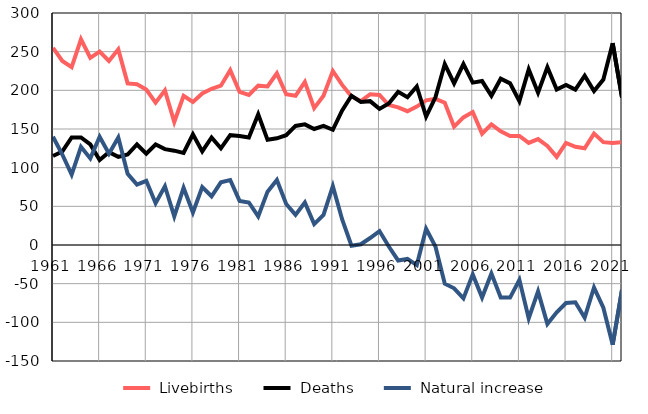
| Category |  Livebirths |  Deaths |  Natural increase |
|---|---|---|---|
| 1961.0 | 255 | 115 | 140 |
| 1962.0 | 238 | 121 | 117 |
| 1963.0 | 230 | 139 | 91 |
| 1964.0 | 266 | 139 | 127 |
| 1965.0 | 242 | 130 | 112 |
| 1966.0 | 250 | 110 | 140 |
| 1967.0 | 238 | 120 | 118 |
| 1968.0 | 253 | 114 | 139 |
| 1969.0 | 209 | 117 | 92 |
| 1970.0 | 208 | 130 | 78 |
| 1971.0 | 201 | 118 | 83 |
| 1972.0 | 184 | 130 | 54 |
| 1973.0 | 200 | 124 | 76 |
| 1974.0 | 159 | 122 | 37 |
| 1975.0 | 193 | 119 | 74 |
| 1976.0 | 185 | 143 | 42 |
| 1977.0 | 196 | 121 | 75 |
| 1978.0 | 202 | 139 | 63 |
| 1979.0 | 206 | 125 | 81 |
| 1980.0 | 226 | 142 | 84 |
| 1981.0 | 198 | 141 | 57 |
| 1982.0 | 194 | 139 | 55 |
| 1983.0 | 206 | 169 | 37 |
| 1984.0 | 205 | 136 | 69 |
| 1985.0 | 222 | 138 | 84 |
| 1986.0 | 195 | 142 | 53 |
| 1987.0 | 193 | 154 | 39 |
| 1988.0 | 211 | 156 | 55 |
| 1989.0 | 177 | 150 | 27 |
| 1990.0 | 193 | 154 | 39 |
| 1991.0 | 225 | 149 | 76 |
| 1992.0 | 207 | 174 | 33 |
| 1993.0 | 192 | 193 | -1 |
| 1994.0 | 186 | 185 | 1 |
| 1995.0 | 195 | 186 | 9 |
| 1996.0 | 194 | 176 | 18 |
| 1997.0 | 181 | 183 | -2 |
| 1998.0 | 178 | 198 | -20 |
| 1999.0 | 173 | 191 | -18 |
| 2000.0 | 179 | 205 | -26 |
| 2001.0 | 187 | 166 | 21 |
| 2002.0 | 189 | 191 | -2 |
| 2003.0 | 184 | 234 | -50 |
| 2004.0 | 153 | 209 | -56 |
| 2005.0 | 165 | 234 | -69 |
| 2006.0 | 172 | 210 | -38 |
| 2007.0 | 144 | 212 | -68 |
| 2008.0 | 156 | 193 | -37 |
| 2009.0 | 147 | 215 | -68 |
| 2010.0 | 141 | 209 | -68 |
| 2011.0 | 141 | 186 | -45 |
| 2012.0 | 132 | 227 | -95 |
| 2013.0 | 137 | 197 | -60 |
| 2014.0 | 128 | 230 | -102 |
| 2015.0 | 114 | 201 | -87 |
| 2016.0 | 132 | 207 | -75 |
| 2017.0 | 127 | 201 | -74 |
| 2018.0 | 125 | 219 | -94 |
| 2019.0 | 144 | 199 | -55 |
| 2020.0 | 133 | 214 | -81 |
| 2021.0 | 132 | 261 | -129 |
| 2022.0 | 133 | 191 | -58 |